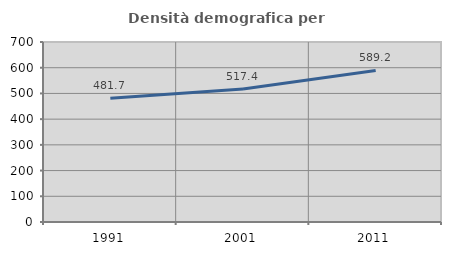
| Category | Densità demografica |
|---|---|
| 1991.0 | 481.675 |
| 2001.0 | 517.382 |
| 2011.0 | 589.175 |